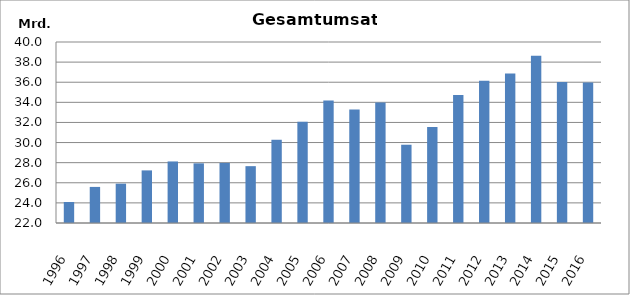
| Category | Umsatz |
|---|---|
| 1996.0 | 24088396 |
| 1997.0 | 25588482 |
| 1998.0 | 25911875 |
| 1999.0 | 27231996 |
| 2000.0 | 28121089 |
| 2001.0 | 27932719 |
| 2002.0 | 27976228 |
| 2003.0 | 27652647 |
| 2004.0 | 30278000 |
| 2005.0 | 32080721 |
| 2006.0 | 34189922 |
| 2007.0 | 33278221 |
| 2008.0 | 33993013 |
| 2009.0 | 29783049 |
| 2010.0 | 31557474.731 |
| 2011.0 | 34741088 |
| 2012.0 | 36149532.004 |
| 2013.0 | 36865319.524 |
| 2014.0 | 38623232.674 |
| 2015.0 | 36018872 |
| 2016.0 | 35975244 |